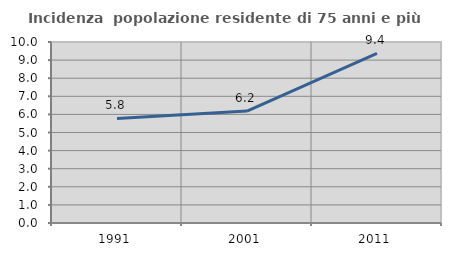
| Category | Incidenza  popolazione residente di 75 anni e più |
|---|---|
| 1991.0 | 5.778 |
| 2001.0 | 6.184 |
| 2011.0 | 9.372 |